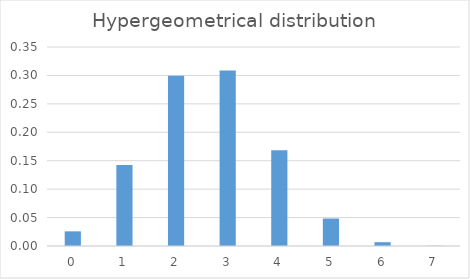
| Category | Series 0 |
|---|---|
| 0.0 | 0.026 |
| 1.0 | 0.142 |
| 2.0 | 0.299 |
| 3.0 | 0.309 |
| 4.0 | 0.168 |
| 5.0 | 0.048 |
| 6.0 | 0.007 |
| 7.0 | 0 |